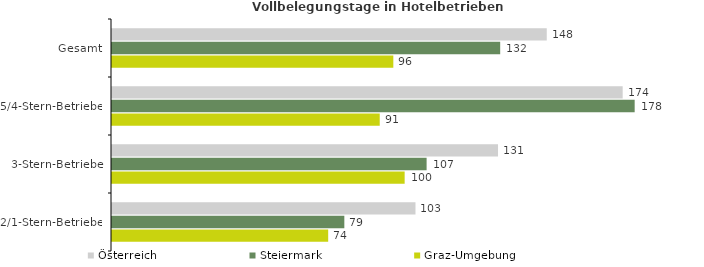
| Category | Österreich | Steiermark | Graz-Umgebung |
|---|---|---|---|
| Gesamt | 147.876 | 132.038 | 95.688 |
| 5/4-Stern-Betriebe | 173.697 | 177.779 | 91.064 |
| 3-Stern-Betriebe | 131.294 | 107.011 | 99.541 |
| 2/1-Stern-Betriebe | 103.222 | 79.024 | 73.533 |